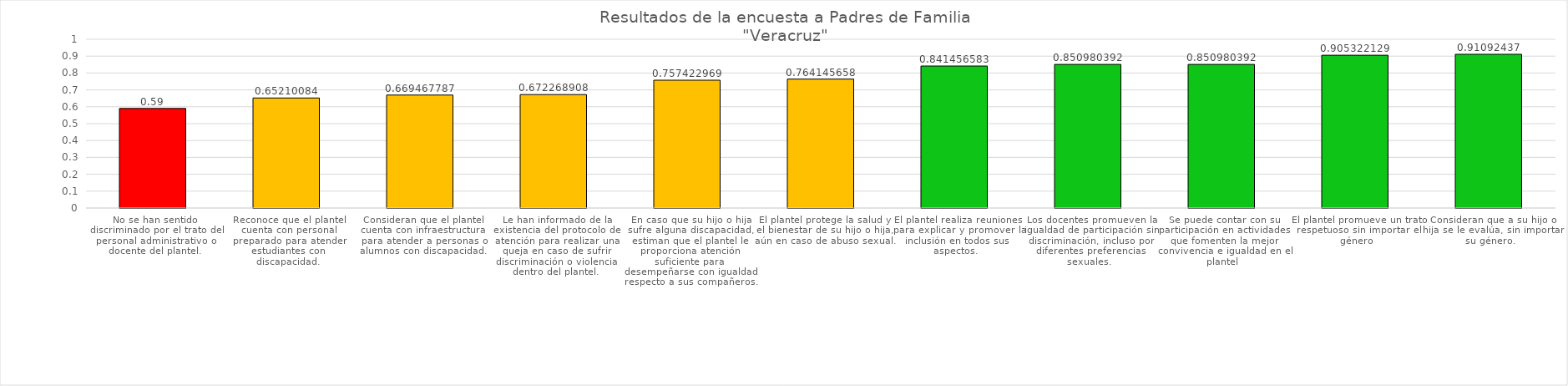
| Category | Series 0 |
|---|---|
| No se han sentido discriminado por el trato del personal administrativo o docente del plantel. | 0.59 |
| Reconoce que el plantel cuenta con personal preparado para atender estudiantes con discapacidad. | 0.652 |
| Consideran que el plantel cuenta con infraestructura para atender a personas o alumnos con discapacidad. | 0.669 |
| Le han informado de la existencia del protocolo de atención para realizar una queja en caso de sufrir discriminación o violencia dentro del plantel. | 0.672 |
| En caso que su hijo o hija sufre alguna discapacidad, estiman que el plantel le proporciona atención suficiente para desempeñarse con igualdad respecto a sus compañeros. | 0.757 |
| El plantel protege la salud y el bienestar de su hijo o hija, aún en caso de abuso sexual. | 0.764 |
| El plantel realiza reuniones para explicar y promover la inclusión en todos sus aspectos. | 0.841 |
| Los docentes promueven la igualdad de participación sin discriminación, incluso por diferentes preferencias sexuales. | 0.851 |
| Se puede contar con su participación en actividades que fomenten la mejor convivencia e igualdad en el plantel | 0.851 |
| El plantel promueve un trato respetuoso sin importar el género | 0.905 |
| Consideran que a su hijo o hija se le evalúa, sin importar su género. | 0.911 |